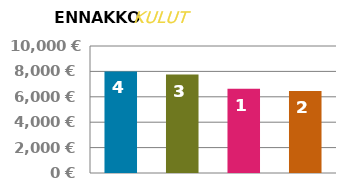
| Category | ENNAKKO |
|---|---|
| 0 | 8000 |
| 1 | 7750 |
| 2 | 6625 |
| 3 | 6450 |